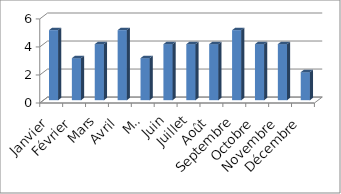
| Category | Pouka |
|---|---|
| Janvier | 5 |
| Février | 3 |
| Mars | 4 |
| Avril | 5 |
| Mai | 3 |
| Juin | 4 |
| Juillet | 4 |
| Août | 4 |
| Septembre | 5 |
| Octobre | 4 |
| Novembre | 4 |
| Décembre | 2 |